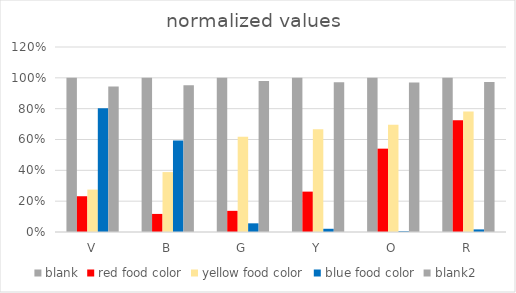
| Category | blank | red food color | yellow food color | blue food color | blank2 |
|---|---|---|---|---|---|
| V | 1 | 0.232 | 0.275 | 0.803 | 0.944 |
| B | 1 | 0.117 | 0.389 | 0.594 | 0.952 |
| G | 1 | 0.137 | 0.617 | 0.056 | 0.98 |
| Y | 1 | 0.262 | 0.666 | 0.021 | 0.972 |
| O | 1 | 0.541 | 0.695 | 0.005 | 0.97 |
| R | 1 | 0.725 | 0.782 | 0.017 | 0.973 |